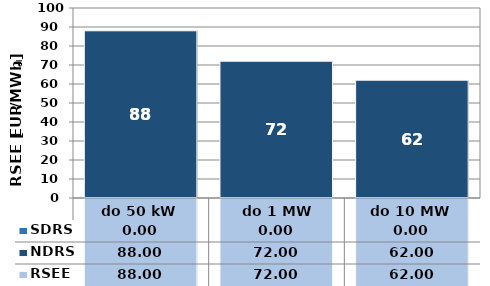
| Category | NDRS | SDRS |
|---|---|---|
| do 50 kW | 88 | 0 |
|  do 1 MW | 72 | 0 |
| do 10 MW | 62 | 0 |